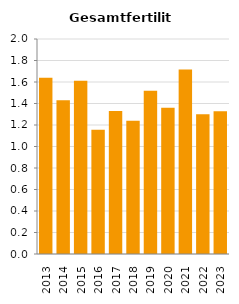
| Category | Gesamtfertilität |
|---|---|
| 2013.0 | 1.639 |
| 2014.0 | 1.43 |
| 2015.0 | 1.612 |
| 2016.0 | 1.157 |
| 2017.0 | 1.329 |
| 2018.0 | 1.239 |
| 2019.0 | 1.518 |
| 2020.0 | 1.36 |
| 2021.0 | 1.716 |
| 2022.0 | 1.3 |
| 2023.0 | 1.328 |